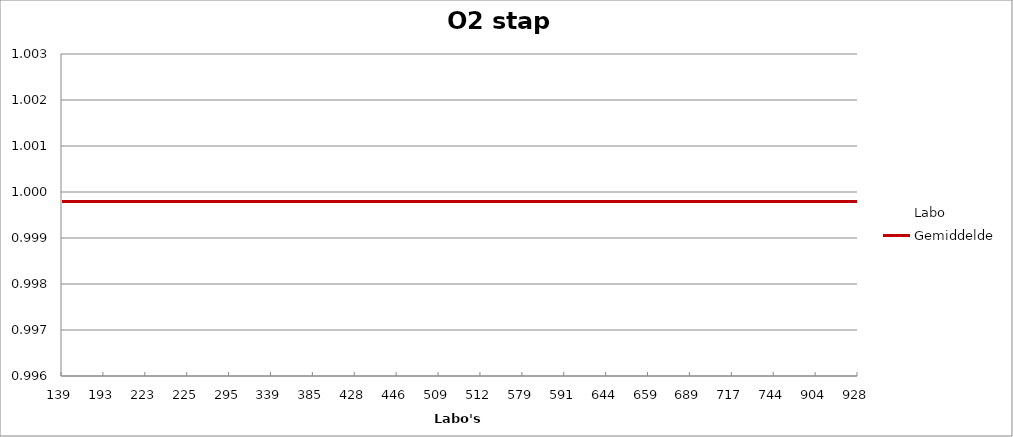
| Category | Labo | Gemiddelde |
|---|---|---|
| 139.0 | 1 | 1 |
| 193.0 | 1 | 1 |
| 223.0 | 1 | 1 |
| 225.0 | 1 | 1 |
| 295.0 | 1 | 1 |
| 339.0 | 1 | 1 |
| 385.0 | 0.999 | 1 |
| 428.0 | 1 | 1 |
| 446.0 | 1 | 1 |
| 509.0 | 1 | 1 |
| 512.0 | 1 | 1 |
| 579.0 | 1 | 1 |
| 591.0 | 1 | 1 |
| 644.0 | 1 | 1 |
| 659.0 | 0.999 | 1 |
| 689.0 | 1 | 1 |
| 717.0 | 1 | 1 |
| 744.0 | 1 | 1 |
| 904.0 | 1 | 1 |
| 928.0 | 0.997 | 1 |